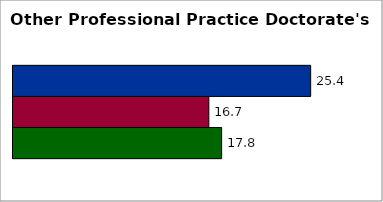
| Category | 50 states and D.C. | SREB states | State |
|---|---|---|---|
| 0 | 25.369 | 16.691 | 17.782 |